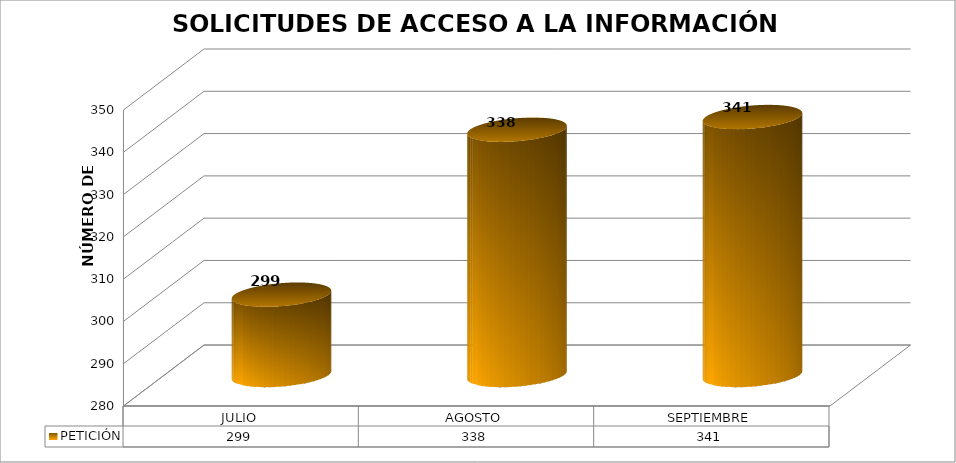
| Category | PETICIÓN |
|---|---|
| JULIO | 299 |
| AGOSTO | 338 |
| SEPTIEMBRE | 341 |